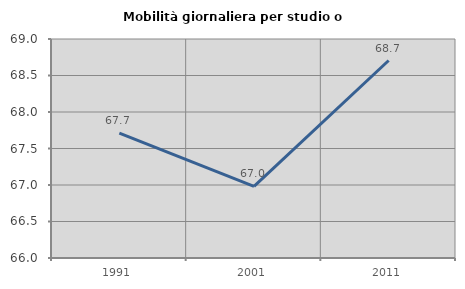
| Category | Mobilità giornaliera per studio o lavoro |
|---|---|
| 1991.0 | 67.711 |
| 2001.0 | 66.981 |
| 2011.0 | 68.705 |